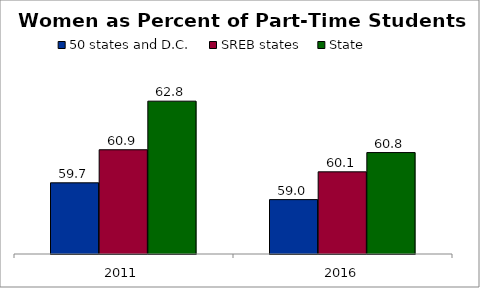
| Category | 50 states and D.C. | SREB states | State |
|---|---|---|---|
| 2011 | 59.679 | 60.923 | 62.752 |
| 2016 | 59.047 | 60.092 | 60.817 |